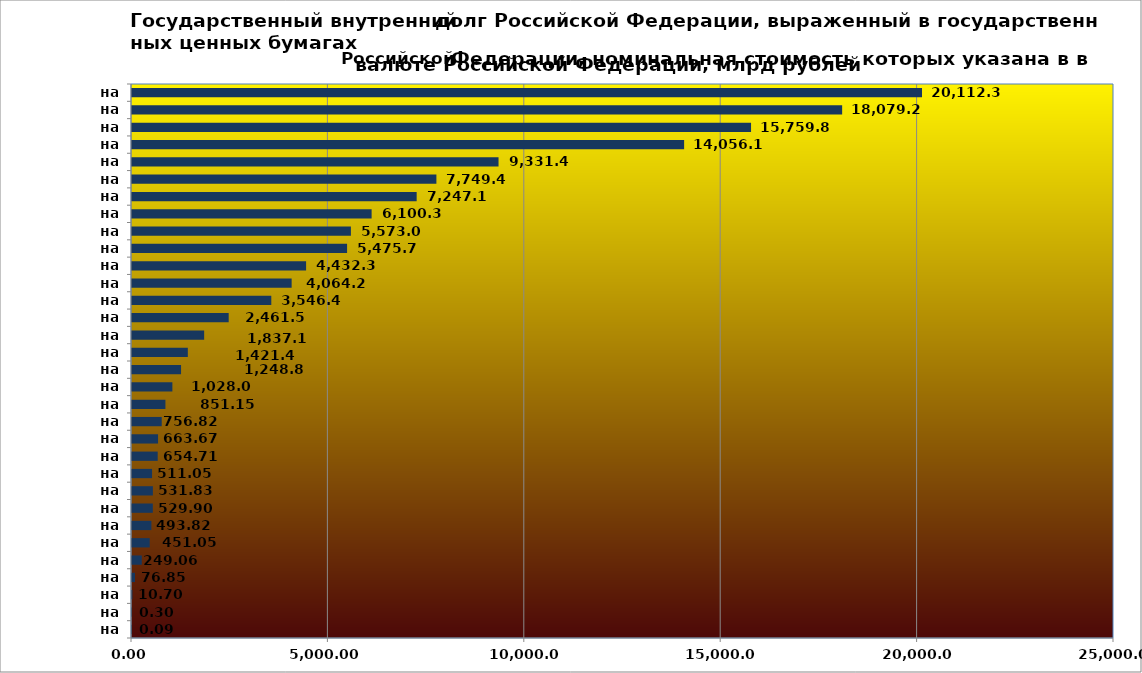
| Category | Series 0 |
|---|---|
| на 01.01.1993 | 0.09 |
| на 01.01.1994 | 0.3 |
| на 01.01.1995 | 10.7 |
| на 01.01.1996 | 76.85 |
| на 01.01.1997 | 249.06 |
| на 01.01.1998 | 451.05 |
| на 01.01.1999 | 493.82 |
| на 01.01.2000 | 529.9 |
| на 01.01.2001 | 531.83 |
| на 01.01.2002 | 511.05 |
| на 01.01.2003 | 654.71 |
| на 01.01.2004 | 663.67 |
| на 01.01.2005 | 756.82 |
| на 01.01.2006 | 851.15 |
| на 01.01.2007 | 1028.06 |
| на 01.01.2008 | 1248.89 |
| на 01.01.2009 | 1421.47 |
| на 01.01.2010 | 1837.17 |
| на 01.01.2011 | 2461.59 |
| на 01.01.2012 | 3546.43 |
| на 01.01.2013 | 4064.28 |
| на 01.01.2014 | 4432.38 |
| на 01.01.2015 | 5475.71 |
| на 01.01.2016 | 5573.09 |
| на 01.01.2017 | 6100.34 |
| на 01.01.2018 | 7247.117 |
| на 01.01.2019 | 7749.47 |
| на 01.01.2020 | 9331.402 |
| на 01.01.2021 | 14056.193 |
| на 01.01.2022 | 15759.851 |
| на 01.01.2023 | 18079.291 |
| на 01.01.2024 | 20112.359 |